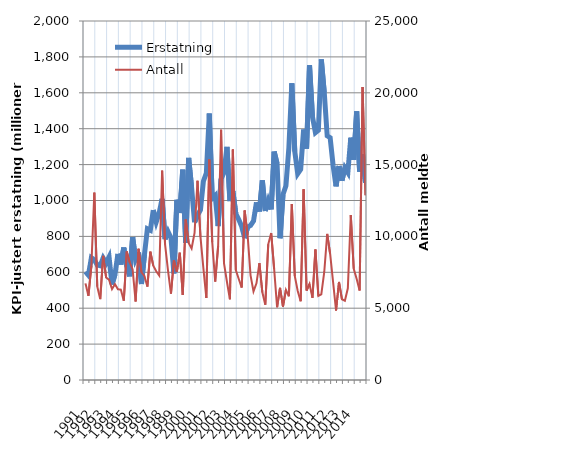
| Category | Erstatning |
|---|---|
| 1991.0 | 603.481 |
| nan | 583.801 |
| nan | 681.18 |
| nan | 669.603 |
| 1992.0 | 640.692 |
| nan | 636.6 |
| nan | 679.715 |
| nan | 652.46 |
| 1993.0 | 685.11 |
| nan | 532.071 |
| nan | 587.038 |
| nan | 702.553 |
| 1994.0 | 643.28 |
| nan | 737.946 |
| nan | 632.475 |
| nan | 577.464 |
| 1995.0 | 795.896 |
| nan | 672.716 |
| nan | 709.814 |
| nan | 535.299 |
| 1996.0 | 697.434 |
| nan | 842.561 |
| nan | 834.158 |
| nan | 946.501 |
| 1997.0 | 880.353 |
| nan | 930.976 |
| nan | 1009.305 |
| nan | 784.671 |
| 1998.0 | 826.639 |
| nan | 792.153 |
| nan | 593.691 |
| nan | 1004.115 |
| 1999.0 | 930.353 |
| nan | 1171.553 |
| nan | 763.248 |
| nan | 1237.391 |
| 2000.0 | 1073.081 |
| nan | 878.192 |
| nan | 918.127 |
| nan | 947.533 |
| 2001.0 | 1107.577 |
| nan | 1152.908 |
| nan | 1484.498 |
| nan | 1011.7 |
| 2002.0 | 1027.564 |
| nan | 857.616 |
| nan | 1119.058 |
| nan | 1157.483 |
| 2003.0 | 1298.758 |
| nan | 996.944 |
| nan | 1052.381 |
| nan | 926.811 |
| 2004.0 | 893.862 |
| nan | 855.082 |
| nan | 790.749 |
| nan | 851.902 |
| 2005.0 | 861.134 |
| nan | 885.928 |
| nan | 989.7 |
| nan | 939.181 |
| 2006.0 | 1112.107 |
| nan | 941.928 |
| nan | 998.915 |
| nan | 950.247 |
| 2007.0 | 1272.529 |
| nan | 1205.484 |
| nan | 789.79 |
| nan | 1033.21 |
| 2008.0 | 1082.173 |
| nan | 1294.715 |
| nan | 1653.143 |
| nan | 1273.488 |
| 2009.0 | 1149.85 |
| nan | 1173.942 |
| nan | 1395.31 |
| nan | 1289.196 |
| 2010.0 | 1753.533 |
| nan | 1467.453 |
| nan | 1377.784 |
| nan | 1391.074 |
| 2011.0 | 1786.114 |
| nan | 1602.462 |
| nan | 1359.902 |
| nan | 1349.973 |
| 2012.0 | 1195.733 |
| nan | 1078.773 |
| nan | 1192.147 |
| nan | 1110.769 |
| 2013.0 | 1181.853 |
| nan | 1155.655 |
| nan | 1350.015 |
| nan | 1227.003 |
| 2014.0 | 1496.943 |
| nan | 1160.463 |
| nan | 1258.954 |
| nan | 1098.824 |